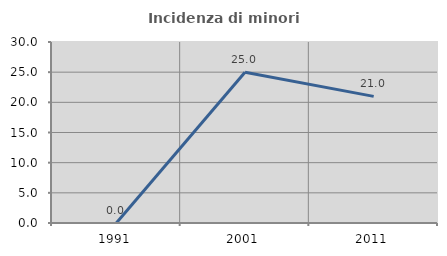
| Category | Incidenza di minori stranieri |
|---|---|
| 1991.0 | 0 |
| 2001.0 | 25 |
| 2011.0 | 20.988 |